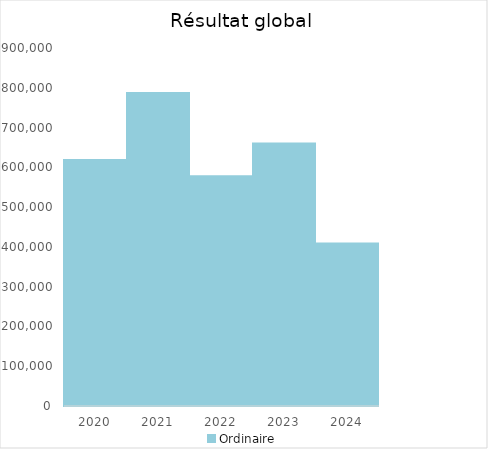
| Category |   | Ordinaire |    |
|---|---|---|---|
| 2020.0 |  | 618414.04 |  |
| 2021.0 |  | 787065 |  |
| 2022.0 |  | 577420.58 |  |
| 2023.0 |  | 659976.74 |  |
| 2024.0 |  | 408779.88 |  |